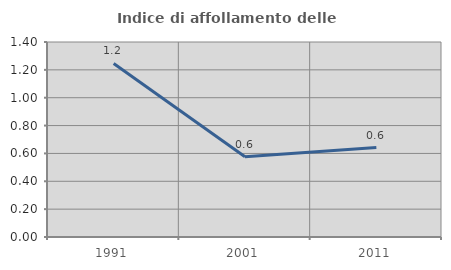
| Category | Indice di affollamento delle abitazioni  |
|---|---|
| 1991.0 | 1.246 |
| 2001.0 | 0.576 |
| 2011.0 | 0.642 |